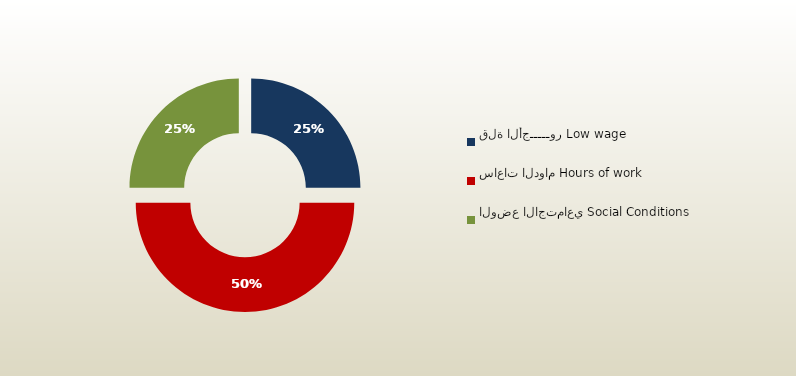
| Category | المجموع
Total |
|---|---|
| قلة الأجـــــور Low wage | 63 |
| ساعات الدوام Hours of work | 126 |
| الوضع الاجتماعي Social Conditions | 63 |